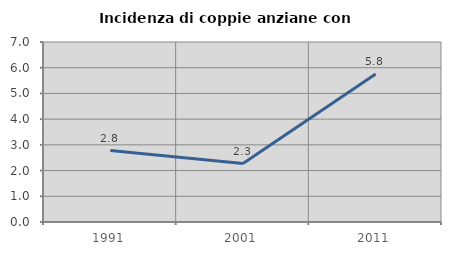
| Category | Incidenza di coppie anziane con figli |
|---|---|
| 1991.0 | 2.778 |
| 2001.0 | 2.273 |
| 2011.0 | 5.755 |